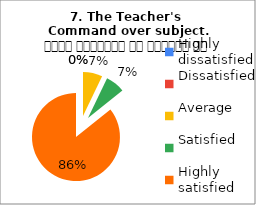
| Category | 7. The Teacher's 
Command over subject. विषय अवधारणा पर शिक्षक का ज्ञान |
|---|---|
| Highly dissatisfied | 0 |
| Dissatisfied | 0 |
| Average | 1 |
| Satisfied | 1 |
| Highly satisfied | 12 |